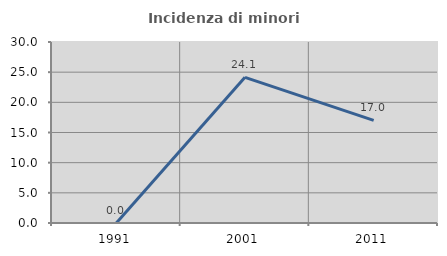
| Category | Incidenza di minori stranieri |
|---|---|
| 1991.0 | 0 |
| 2001.0 | 24.138 |
| 2011.0 | 17.021 |